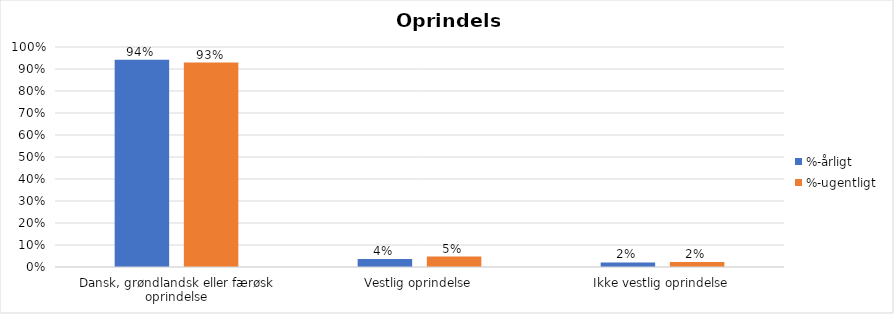
| Category | %-årligt | %-ugentligt |
|---|---|---|
| Dansk, grøndlandsk eller færøsk oprindelse | 0.942 | 0.929 |
| Vestlig oprindelse | 0.037 | 0.047 |
| Ikke vestlig oprindelse | 0.021 | 0.023 |